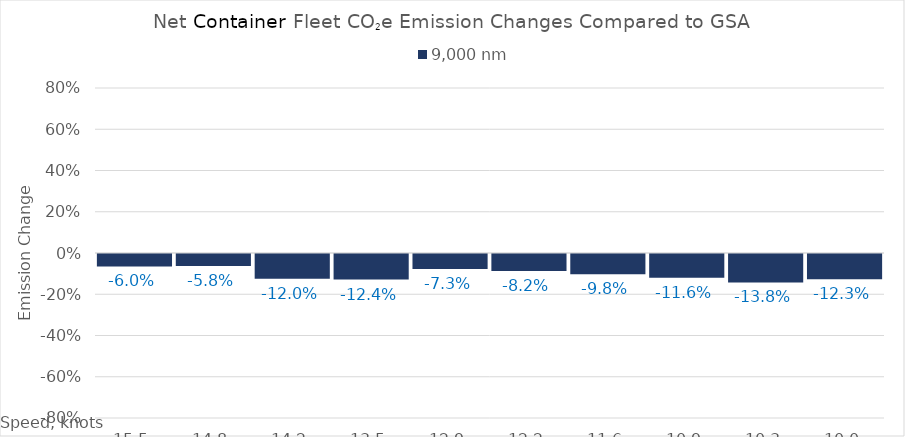
| Category | 9,000 |
|---|---|
| 15.450000000000001 | -0.06 |
| 14.8 | -0.058 |
| 14.15 | -0.12 |
| 13.5 | -0.124 |
| 12.85 | -0.073 |
| 12.2 | -0.082 |
| 11.549999999999999 | -0.098 |
| 10.899999999999999 | -0.116 |
| 10.249999999999998 | -0.138 |
| 10.0 | -0.123 |